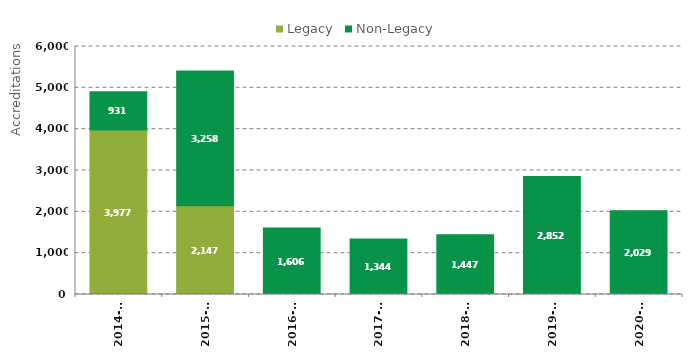
| Category | Legacy | Non-Legacy |
|---|---|---|
| 2014-15 | 3977 | 931 |
| 2015-16 | 2147 | 3258 |
| 2016-17 | 0 | 1606 |
| 2017-18 | 1 | 1344 |
| 2018-19 | 0 | 1447 |
| 2019-20 | 0 | 2852 |
| 2020-21 | 0 | 2029 |